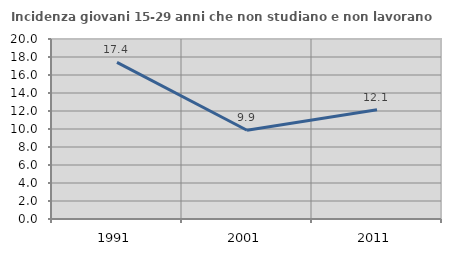
| Category | Incidenza giovani 15-29 anni che non studiano e non lavorano  |
|---|---|
| 1991.0 | 17.408 |
| 2001.0 | 9.859 |
| 2011.0 | 12.15 |